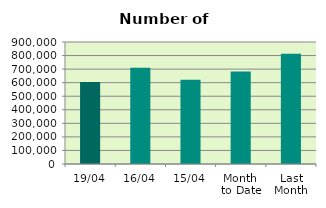
| Category | Series 0 |
|---|---|
| 19/04 | 604382 |
| 16/04 | 709722 |
| 15/04 | 621476 |
| Month 
to Date | 682045.273 |
| Last
Month | 813408 |